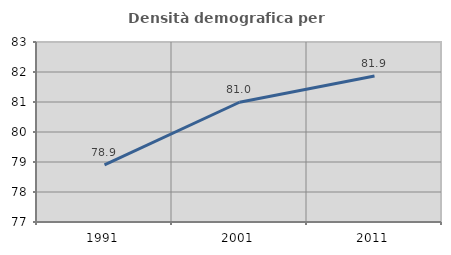
| Category | Densità demografica |
|---|---|
| 1991.0 | 78.906 |
| 2001.0 | 80.992 |
| 2011.0 | 81.869 |